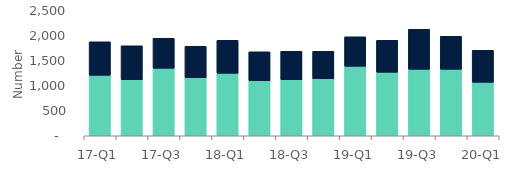
| Category | Homeowners | Buy-to-let |
|---|---|---|
| 17-Q1 | 1210 | 670 |
| 17-Q2 | 1120 | 680 |
| 17-Q3 | 1350 | 600 |
| 17-Q4 | 1160 | 630 |
| 18-Q1 | 1250 | 660 |
| 18-Q2 | 1100 | 580 |
| 18-Q3 | 1120 | 570 |
| 18-Q4 | 1140 | 550 |
| 19-Q1 | 1390 | 590 |
| 19-Q2 | 1270 | 640 |
| 19-Q3 | 1330 | 800 |
| 19-Q4 | 1330 | 660 |
| 20-Q1 | 1070 | 640 |